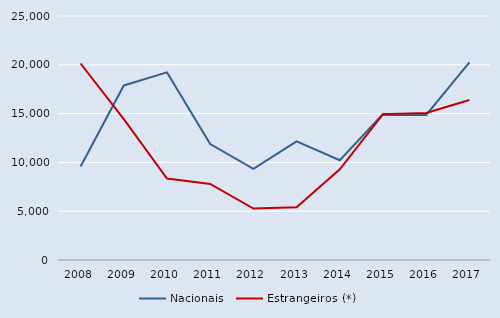
| Category | Nacionais | Estrangeiros (*) |
|---|---|---|
| 2008.0 | 9586 | 20132 |
| 2009.0 | 17883 | 14424 |
| 2010.0 | 19222 | 8353 |
| 2011.0 | 11872 | 7795 |
| 2012.0 | 9334 | 5272 |
| 2013.0 | 12156 | 5398 |
| 2014.0 | 10218 | 9298 |
| 2015.0 | 14949 | 14947 |
| 2016.0 | 14862 | 15063 |
| 2017.0 | 20249 | 16390 |